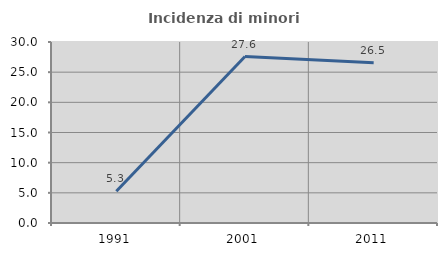
| Category | Incidenza di minori stranieri |
|---|---|
| 1991.0 | 5.263 |
| 2001.0 | 27.595 |
| 2011.0 | 26.545 |